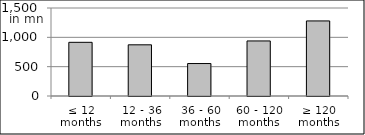
| Category | volume |
|---|---|
| ≤ 12 months | 914925726.4 |
| 12 - 36 months | 872257807.1 |
| 36 - 60 months | 553438472.88 |
| 60 - 120 months | 938358566.69 |
| ≥ 120 months | 1279691646.46 |